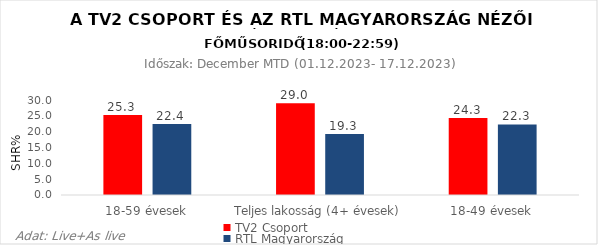
| Category | TV2 Csoport | RTL Magyarország |
|---|---|---|
| 18-59 évesek | 25.3 | 22.4 |
| Teljes lakosság (4+ évesek) | 29 | 19.3 |
| 18-49 évesek | 24.3 | 22.3 |